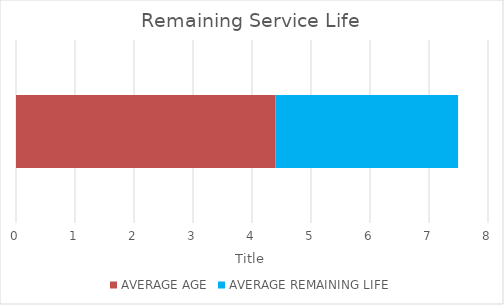
| Category | AVERAGE AGE | AVERAGE REMAINING LIFE |
|---|---|---|
| BACKLOG % OF TOTAL ASSET VALUE | 4.398 | 3.095 |